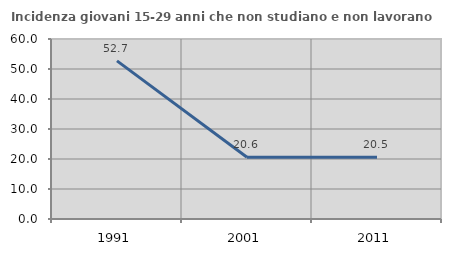
| Category | Incidenza giovani 15-29 anni che non studiano e non lavorano  |
|---|---|
| 1991.0 | 52.696 |
| 2001.0 | 20.581 |
| 2011.0 | 20.545 |